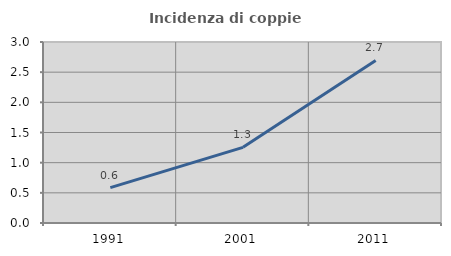
| Category | Incidenza di coppie miste |
|---|---|
| 1991.0 | 0.586 |
| 2001.0 | 1.254 |
| 2011.0 | 2.695 |